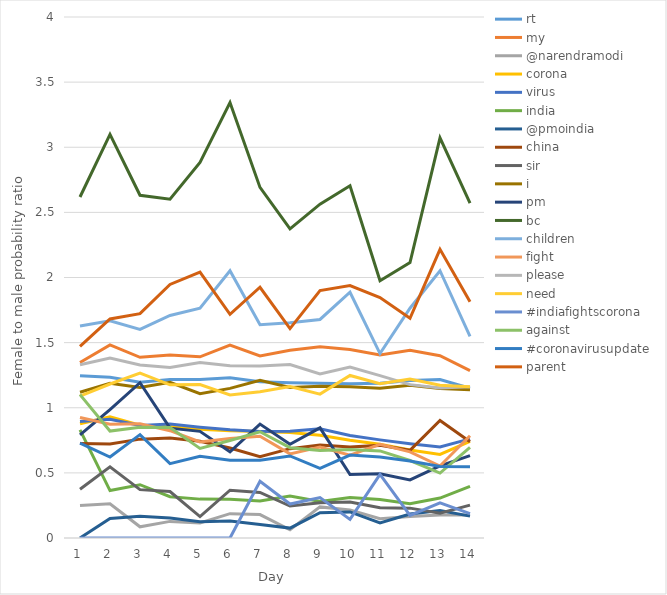
| Category | rt | my | @narendramodi | corona | virus | india | @pmoindia | china | sir | i | pm | bc | children | fight | please | need | #indiafightscorona | against | #coronavirusupdate | parent |
|---|---|---|---|---|---|---|---|---|---|---|---|---|---|---|---|---|---|---|---|---|
| 0 | 1.246 | 1.347 | 0.25 | 0.877 | 0.895 | 0.83 | 0 | 0.725 | 0.374 | 1.119 | 0.792 | 2.618 | 1.628 | 0.926 | 1.33 | 1.09 | 0 | 1.101 | 0.729 | 1.471 |
| 1 | 1.234 | 1.482 | 0.263 | 0.931 | 0.912 | 0.364 | 0.15 | 0.721 | 0.547 | 1.189 | 0.986 | 3.099 | 1.668 | 0.873 | 1.381 | 1.182 | 0 | 0.821 | 0.621 | 1.681 |
| 2 | 1.197 | 1.387 | 0.086 | 0.866 | 0.863 | 0.409 | 0.167 | 0.759 | 0.371 | 1.155 | 1.192 | 2.631 | 1.602 | 0.878 | 1.329 | 1.266 | 0 | 0.85 | 0.793 | 1.723 |
| 3 | 1.216 | 1.406 | 0.127 | 0.858 | 0.876 | 0.317 | 0.153 | 0.768 | 0.357 | 1.196 | 0.843 | 2.601 | 1.708 | 0.824 | 1.309 | 1.176 | 0 | 0.849 | 0.571 | 1.947 |
| 4 | 1.217 | 1.391 | 0.115 | 0.834 | 0.851 | 0.298 | 0.124 | 0.742 | 0.164 | 1.107 | 0.819 | 2.883 | 1.765 | 0.737 | 1.347 | 1.179 | 0 | 0.688 | 0.628 | 2.042 |
| 5 | 1.23 | 1.481 | 0.187 | 0.823 | 0.832 | 0.298 | 0.13 | 0.691 | 0.367 | 1.149 | 0.661 | 3.343 | 2.051 | 0.764 | 1.322 | 1.099 | 0 | 0.749 | 0.597 | 1.717 |
| 6 | 1.199 | 1.397 | 0.18 | 0.818 | 0.818 | 0.284 | 0.104 | 0.624 | 0.35 | 1.211 | 0.874 | 2.692 | 1.637 | 0.781 | 1.32 | 1.122 | 0.436 | 0.816 | 0.597 | 1.925 |
| 7 | 1.191 | 1.441 | 0.063 | 0.811 | 0.819 | 0.323 | 0.076 | 0.686 | 0.245 | 1.156 | 0.72 | 2.373 | 1.653 | 0.646 | 1.332 | 1.164 | 0.261 | 0.694 | 0.63 | 1.608 |
| 8 | 1.188 | 1.469 | 0.239 | 0.789 | 0.839 | 0.28 | 0.194 | 0.713 | 0.271 | 1.165 | 0.846 | 2.563 | 1.678 | 0.699 | 1.259 | 1.105 | 0.31 | 0.672 | 0.535 | 1.899 |
| 9 | 1.184 | 1.448 | 0.215 | 0.751 | 0.787 | 0.31 | 0.2 | 0.7 | 0.276 | 1.161 | 0.487 | 2.705 | 1.887 | 0.636 | 1.312 | 1.248 | 0.143 | 0.679 | 0.637 | 1.937 |
| 10 | 1.188 | 1.405 | 0.149 | 0.72 | 0.753 | 0.296 | 0.116 | 0.711 | 0.232 | 1.15 | 0.493 | 1.975 | 1.416 | 0.719 | 1.247 | 1.185 | 0.488 | 0.669 | 0.623 | 1.846 |
| 11 | 1.208 | 1.441 | 0.166 | 0.675 | 0.724 | 0.263 | 0.184 | 0.673 | 0.229 | 1.172 | 0.446 | 2.115 | 1.764 | 0.661 | 1.178 | 1.22 | 0.173 | 0.595 | 0.59 | 1.687 |
| 12 | 1.217 | 1.399 | 0.177 | 0.641 | 0.699 | 0.307 | 0.211 | 0.903 | 0.19 | 1.147 | 0.554 | 3.072 | 2.052 | 0.553 | 1.151 | 1.172 | 0.27 | 0.499 | 0.55 | 2.216 |
| 13 | 1.15 | 1.285 | 0.177 | 0.743 | 0.761 | 0.397 | 0.168 | 0.739 | 0.253 | 1.137 | 0.632 | 2.571 | 1.548 | 0.785 | 1.162 | 1.161 | 0.187 | 0.695 | 0.546 | 1.814 |